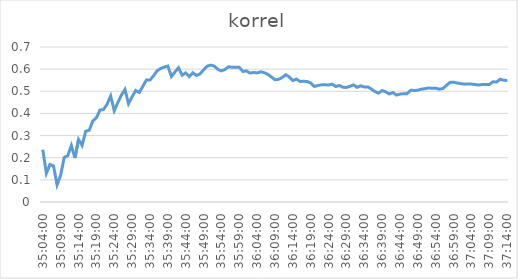
| Category | korrel |
|---|---|
| 1900-01-01 11:04:00 | 0.236 |
| 1900-01-01 11:05:00 | 0.129 |
| 1900-01-01 11:06:00 | 0.169 |
| 1900-01-01 11:07:00 | 0.163 |
| 1900-01-01 11:08:00 | 0.077 |
| 1900-01-01 11:09:00 | 0.121 |
| 1900-01-01 11:10:00 | 0.201 |
| 1900-01-01 11:11:00 | 0.21 |
| 1900-01-01 11:12:00 | 0.255 |
| 1900-01-01 11:13:00 | 0.199 |
| 1900-01-01 11:14:00 | 0.282 |
| 1900-01-01 11:15:00 | 0.255 |
| 1900-01-01 11:16:00 | 0.32 |
| 1900-01-01 11:17:00 | 0.324 |
| 1900-01-01 11:18:00 | 0.366 |
| 1900-01-01 11:19:00 | 0.38 |
| 1900-01-01 11:20:00 | 0.415 |
| 1900-01-01 11:21:00 | 0.418 |
| 1900-01-01 11:22:00 | 0.442 |
| 1900-01-01 11:23:00 | 0.479 |
| 1900-01-01 11:24:00 | 0.412 |
| 1900-01-01 11:25:00 | 0.449 |
| 1900-01-01 11:26:00 | 0.483 |
| 1900-01-01 11:27:00 | 0.508 |
| 1900-01-01 11:28:00 | 0.444 |
| 1900-01-01 11:29:00 | 0.475 |
| 1900-01-01 11:30:00 | 0.504 |
| 1900-01-01 11:31:00 | 0.495 |
| 1900-01-01 11:32:00 | 0.522 |
| 1900-01-01 11:33:00 | 0.551 |
| 1900-01-01 11:34:00 | 0.551 |
| 1900-01-01 11:35:00 | 0.57 |
| 1900-01-01 11:36:00 | 0.593 |
| 1900-01-01 11:37:00 | 0.603 |
| 1900-01-01 11:38:00 | 0.609 |
| 1900-01-01 11:39:00 | 0.614 |
| 1900-01-01 11:40:00 | 0.567 |
| 1900-01-01 11:41:00 | 0.588 |
| 1900-01-01 11:42:00 | 0.606 |
| 1900-01-01 11:43:00 | 0.573 |
| 1900-01-01 11:44:00 | 0.583 |
| 1900-01-01 11:45:00 | 0.566 |
| 1900-01-01 11:46:00 | 0.584 |
| 1900-01-01 11:47:00 | 0.571 |
| 1900-01-01 11:48:00 | 0.578 |
| 1900-01-01 11:49:00 | 0.597 |
| 1900-01-01 11:50:00 | 0.613 |
| 1900-01-01 11:51:00 | 0.618 |
| 1900-01-01 11:52:00 | 0.614 |
| 1900-01-01 11:53:00 | 0.599 |
| 1900-01-01 11:54:00 | 0.592 |
| 1900-01-01 11:55:00 | 0.598 |
| 1900-01-01 11:56:00 | 0.611 |
| 1900-01-01 11:57:00 | 0.608 |
| 1900-01-01 11:58:00 | 0.608 |
| 1900-01-01 11:59:00 | 0.608 |
| 1900-01-01 12:00:00 | 0.59 |
| 1900-01-01 12:01:00 | 0.592 |
| 1900-01-01 12:02:00 | 0.582 |
| 1900-01-01 12:03:00 | 0.585 |
| 1900-01-01 12:04:00 | 0.583 |
| 1900-01-01 12:05:00 | 0.588 |
| 1900-01-01 12:06:00 | 0.584 |
| 1900-01-01 12:07:00 | 0.576 |
| 1900-01-01 12:08:00 | 0.565 |
| 1900-01-01 12:09:00 | 0.552 |
| 1900-01-01 12:10:00 | 0.554 |
| 1900-01-01 12:11:00 | 0.562 |
| 1900-01-01 12:12:00 | 0.575 |
| 1900-01-01 12:13:00 | 0.565 |
| 1900-01-01 12:14:00 | 0.548 |
| 1900-01-01 12:15:00 | 0.555 |
| 1900-01-01 12:16:00 | 0.544 |
| 1900-01-01 12:17:00 | 0.545 |
| 1900-01-01 12:18:00 | 0.544 |
| 1900-01-01 12:19:00 | 0.537 |
| 1900-01-01 12:20:00 | 0.522 |
| 1900-01-01 12:21:00 | 0.526 |
| 1900-01-01 12:22:00 | 0.529 |
| 1900-01-01 12:23:00 | 0.53 |
| 1900-01-01 12:24:00 | 0.528 |
| 1900-01-01 12:25:00 | 0.533 |
| 1900-01-01 12:26:00 | 0.521 |
| 1900-01-01 12:27:00 | 0.526 |
| 1900-01-01 12:28:00 | 0.518 |
| 1900-01-01 12:29:00 | 0.517 |
| 1900-01-01 12:30:00 | 0.523 |
| 1900-01-01 12:31:00 | 0.529 |
| 1900-01-01 12:32:00 | 0.518 |
| 1900-01-01 12:33:00 | 0.525 |
| 1900-01-01 12:34:00 | 0.52 |
| 1900-01-01 12:35:00 | 0.52 |
| 1900-01-01 12:36:00 | 0.51 |
| 1900-01-01 12:37:00 | 0.499 |
| 1900-01-01 12:38:00 | 0.492 |
| 1900-01-01 12:39:00 | 0.503 |
| 1900-01-01 12:40:00 | 0.498 |
| 1900-01-01 12:41:00 | 0.488 |
| 1900-01-01 12:42:00 | 0.494 |
| 1900-01-01 12:43:00 | 0.483 |
| 1900-01-01 12:44:00 | 0.487 |
| 1900-01-01 12:45:00 | 0.489 |
| 1900-01-01 12:46:00 | 0.489 |
| 1900-01-01 12:47:00 | 0.505 |
| 1900-01-01 12:48:00 | 0.504 |
| 1900-01-01 12:49:00 | 0.505 |
| 1900-01-01 12:50:00 | 0.51 |
| 1900-01-01 12:51:00 | 0.512 |
| 1900-01-01 12:52:00 | 0.515 |
| 1900-01-01 12:53:00 | 0.513 |
| 1900-01-01 12:54:00 | 0.514 |
| 1900-01-01 12:55:00 | 0.51 |
| 1900-01-01 12:56:00 | 0.512 |
| 1900-01-01 12:57:00 | 0.527 |
| 1900-01-01 12:58:00 | 0.54 |
| 1900-01-01 12:59:00 | 0.541 |
| 1900-01-01 13:00:00 | 0.537 |
| 1900-01-01 13:01:00 | 0.535 |
| 1900-01-01 13:02:00 | 0.532 |
| 1900-01-01 13:03:00 | 0.533 |
| 1900-01-01 13:04:00 | 0.532 |
| 1900-01-01 13:05:00 | 0.531 |
| 1900-01-01 13:06:00 | 0.528 |
| 1900-01-01 13:07:00 | 0.531 |
| 1900-01-01 13:08:00 | 0.531 |
| 1900-01-01 13:09:00 | 0.531 |
| 1900-01-01 13:10:00 | 0.543 |
| 1900-01-01 13:11:00 | 0.541 |
| 1900-01-01 13:12:00 | 0.554 |
| 1900-01-01 13:13:00 | 0.55 |
| 1900-01-01 13:14:00 | 0.549 |